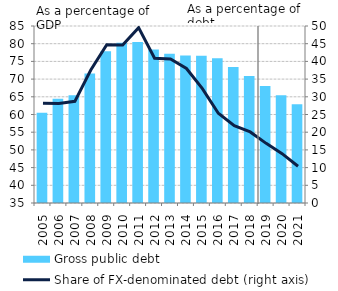
| Category | Gross public debt |
|---|---|
| 2005.0 | 60.478 |
| 2006.0 | 64.456 |
| 2007.0 | 65.472 |
| 2008.0 | 71.581 |
| 2009.0 | 77.842 |
| 2010.0 | 80.249 |
| 2011.0 | 80.482 |
| 2012.0 | 78.373 |
| 2013.0 | 77.145 |
| 2014.0 | 76.649 |
| 2015.0 | 76.607 |
| 2016.0 | 75.864 |
| 2017.0 | 73.414 |
| 2018.0 | 70.845 |
| 2019.0 | 68.068 |
| 2020.0 | 65.432 |
| 2021.0 | 62.899 |